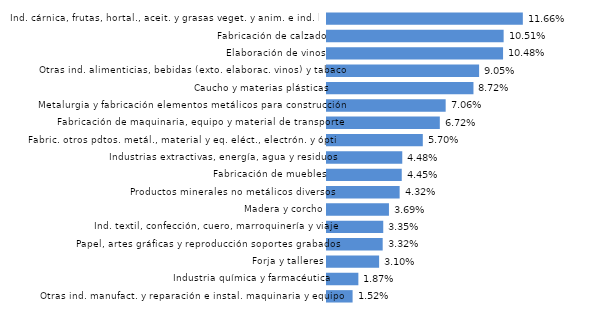
| Category | La Rioja |
|---|---|
| Otras ind. manufact. y reparación e instal. maquinaria y equipo | 0.015 |
| Industria química y farmacéutica | 0.019 |
| Forja y talleres | 0.031 |
| Papel, artes gráficas y reproducción soportes grabados | 0.033 |
| Ind. textil, confección, cuero, marroquinería y viaje | 0.033 |
| Madera y corcho | 0.037 |
| Productos minerales no metálicos diversos | 0.043 |
| Fabricación de muebles | 0.044 |
| Industrias extractivas, energía, agua y residuos | 0.045 |
| Fabric. otros pdtos. metál., material y eq. eléct., electrón. y óptico | 0.057 |
| Fabricación de maquinaria, equipo y material de transporte | 0.067 |
| Metalurgia y fabricación elementos metálicos para construcción | 0.071 |
| Caucho y materias plásticas | 0.087 |
| Otras ind. alimenticias, bebidas (exto. elaborac. vinos) y tabaco | 0.091 |
| Elaboración de vinos | 0.105 |
| Fabricación de calzado | 0.105 |
| Ind. cárnica, frutas, hortal., aceit. y grasas veget. y anim. e ind. láctea | 0.117 |